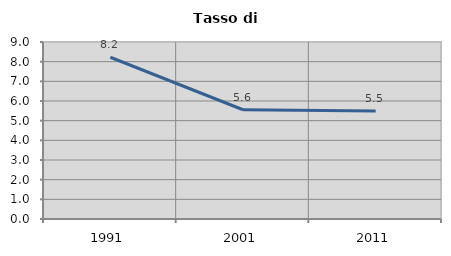
| Category | Tasso di disoccupazione   |
|---|---|
| 1991.0 | 8.225 |
| 2001.0 | 5.556 |
| 2011.0 | 5.497 |